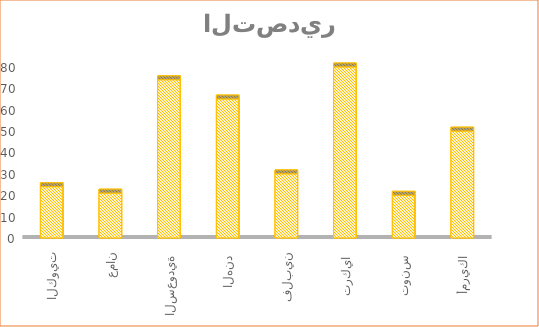
| Category | نسبة التصدير |
|---|---|
| 0 | 50 |
| 1 | 20 |
| 2 | 80 |
| 3 | 30 |
| 4 | 65 |
| 5 | 74 |
| 6 | 21 |
| 7 | 24 |